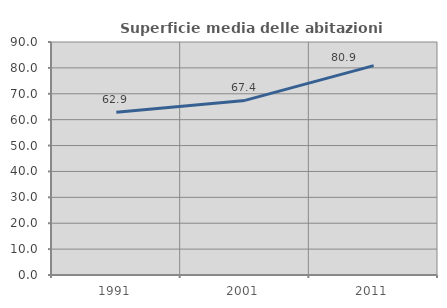
| Category | Superficie media delle abitazioni occupate |
|---|---|
| 1991.0 | 62.867 |
| 2001.0 | 67.448 |
| 2011.0 | 80.86 |